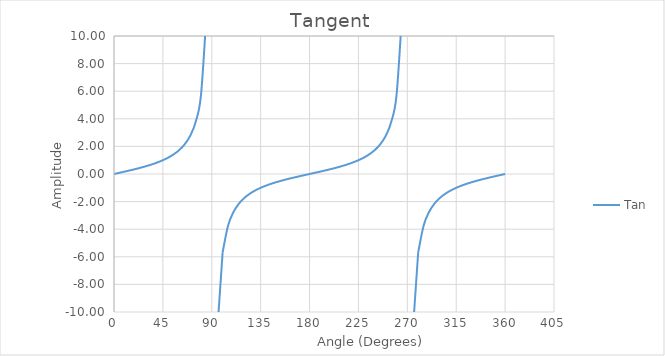
| Category | Tan |
|---|---|
| 0.0 | 0 |
| 5.0 | 0.087 |
| 10.0 | 0.176 |
| 15.0 | 0.268 |
| 20.0 | 0.364 |
| 25.0 | 0.466 |
| 30.0 | 0.577 |
| 35.0 | 0.7 |
| 40.0 | 0.839 |
| 45.0 | 1 |
| 50.0 | 1.192 |
| 55.0 | 1.428 |
| 60.0 | 1.732 |
| 65.0 | 2.145 |
| 70.0 | 2.747 |
| 75.0 | 3.732 |
| 80.0 | 5.671 |
| 85.0 | 11.43 |
| 90.0 | 16324552277619074 |
| 95.0 | -11.43 |
| 100.0 | -5.671 |
| 105.0 | -3.732 |
| 110.0 | -2.747 |
| 115.0 | -2.145 |
| 120.0 | -1.732 |
| 125.0 | -1.428 |
| 130.0 | -1.192 |
| 135.0 | -1 |
| 140.0 | -0.839 |
| 145.0 | -0.7 |
| 150.0 | -0.577 |
| 155.0 | -0.466 |
| 160.0 | -0.364 |
| 165.0 | -0.268 |
| 170.0 | -0.176 |
| 175.0 | -0.087 |
| 180.0 | 0 |
| 185.0 | 0.087 |
| 190.0 | 0.176 |
| 195.0 | 0.268 |
| 200.0 | 0.364 |
| 205.0 | 0.466 |
| 210.0 | 0.577 |
| 215.0 | 0.7 |
| 220.0 | 0.839 |
| 225.0 | 1 |
| 230.0 | 1.192 |
| 235.0 | 1.428 |
| 240.0 | 1.732 |
| 245.0 | 2.145 |
| 250.0 | 2.747 |
| 255.0 | 3.732 |
| 260.0 | 5.671 |
| 265.0 | 11.43 |
| 270.0 | 5441517425873024 |
| 275.0 | -11.43 |
| 280.0 | -5.671 |
| 285.0 | -3.732 |
| 290.0 | -2.747 |
| 295.0 | -2.145 |
| 300.0 | -1.732 |
| 305.0 | -1.428 |
| 310.0 | -1.192 |
| 315.0 | -1 |
| 320.0 | -0.839 |
| 325.0 | -0.7 |
| 330.0 | -0.577 |
| 335.0 | -0.466 |
| 340.0 | -0.364 |
| 345.0 | -0.268 |
| 350.0 | -0.176 |
| 355.0 | -0.087 |
| 360.0 | 0 |